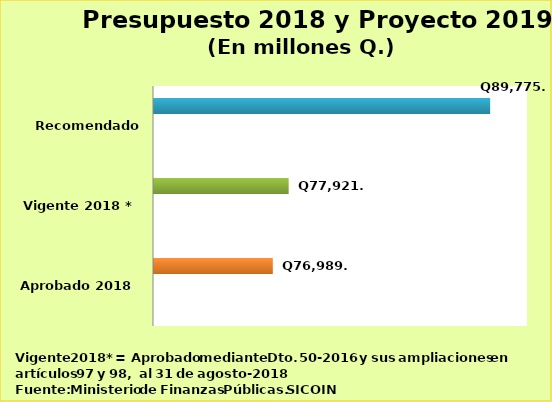
| Category | Series 0 | Series 2 | Series 3 |
|---|---|---|---|
| Aprobado 2018 |  |  | 76989.5 |
| Vigente 2018 * |  |  | 77921.406 |
| Recomendado 2019 |  |  | 89775.064 |